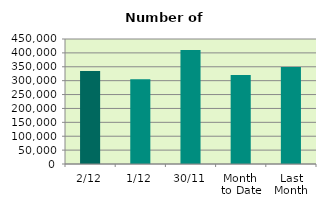
| Category | Series 0 |
|---|---|
| 2/12 | 334710 |
| 1/12 | 305268 |
| 30/11 | 410374 |
| Month 
to Date | 319989 |
| Last
Month | 349295 |